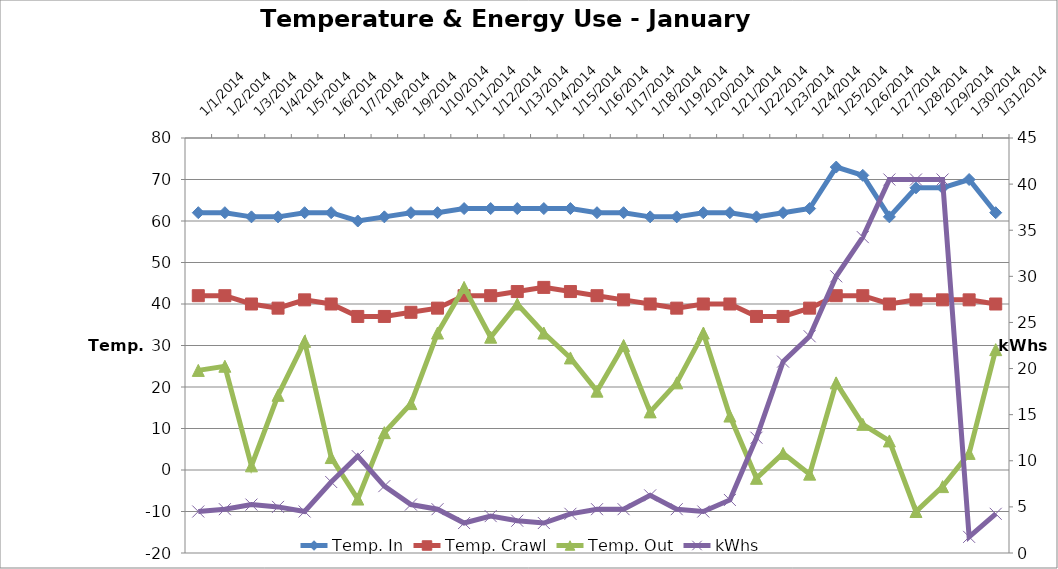
| Category | Temp. In | Temp. Crawl | Temp. Out |
|---|---|---|---|
| 1/1/14 | 62 | 42 | 24 |
| 1/2/14 | 62 | 42 | 25 |
| 1/3/14 | 61 | 40 | 1 |
| 1/4/14 | 61 | 39 | 18 |
| 1/5/14 | 62 | 41 | 31 |
| 1/6/14 | 62 | 40 | 3 |
| 1/7/14 | 60 | 37 | -7 |
| 1/8/14 | 61 | 37 | 9 |
| 1/9/14 | 62 | 38 | 16 |
| 1/10/14 | 62 | 39 | 33 |
| 1/11/14 | 63 | 42 | 44 |
| 1/12/14 | 63 | 42 | 32 |
| 1/13/14 | 63 | 43 | 40 |
| 1/14/14 | 63 | 44 | 33 |
| 1/15/14 | 63 | 43 | 27 |
| 1/16/14 | 62 | 42 | 19 |
| 1/17/14 | 62 | 41 | 30 |
| 1/18/14 | 61 | 40 | 14 |
| 1/19/14 | 61 | 39 | 21 |
| 1/20/14 | 62 | 40 | 33 |
| 1/21/14 | 62 | 40 | 13 |
| 1/22/14 | 61 | 37 | -2 |
| 1/23/14 | 62 | 37 | 4 |
| 1/24/14 | 63 | 39 | -1 |
| 1/25/14 | 73 | 42 | 21 |
| 1/26/14 | 71 | 42 | 11 |
| 1/27/14 | 61 | 40 | 7 |
| 1/28/14 | 68 | 41 | -10 |
| 1/29/14 | 68 | 41 | -4 |
| 1/30/14 | 70 | 41 | 4 |
| 1/31/14 | 62 | 40 | 29 |